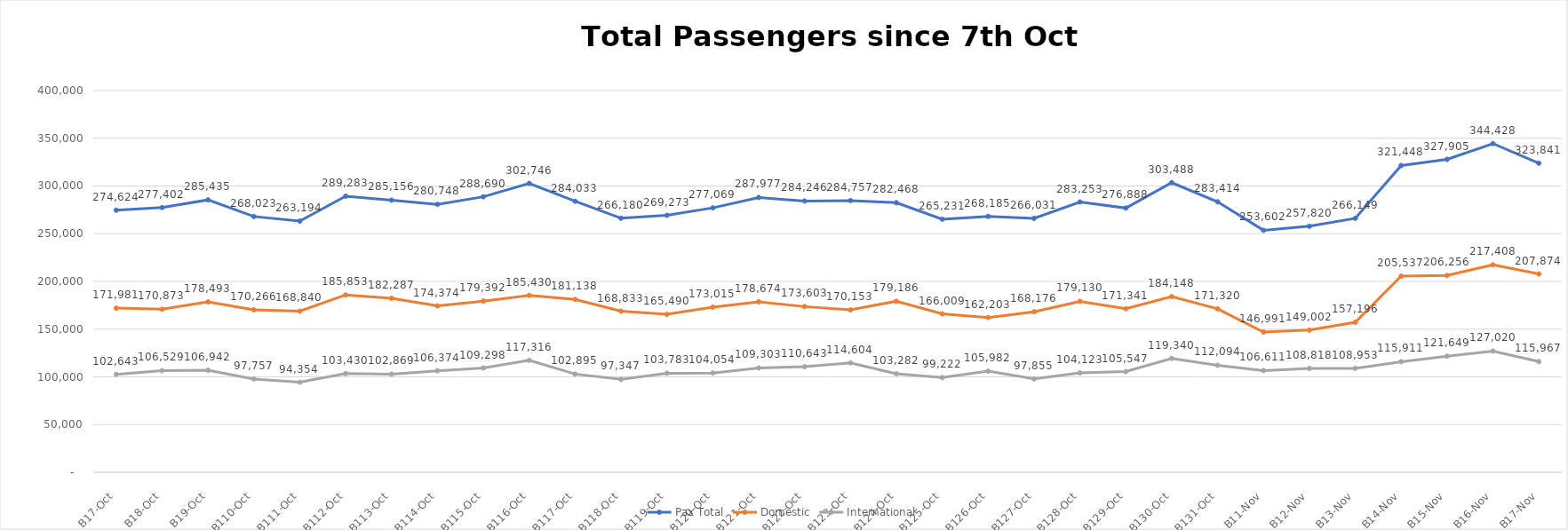
| Category | Pax Total |  Domestic  |  International  |
|---|---|---|---|
| 2022-10-07 | 274624 | 171981 | 102643 |
| 2022-10-08 | 277402 | 170873 | 106529 |
| 2022-10-09 | 285435 | 178493 | 106942 |
| 2022-10-10 | 268023 | 170266 | 97757 |
| 2022-10-11 | 263194 | 168840 | 94354 |
| 2022-10-12 | 289283 | 185853 | 103430 |
| 2022-10-13 | 285156 | 182287 | 102869 |
| 2022-10-14 | 280748 | 174374 | 106374 |
| 2022-10-15 | 288690 | 179392 | 109298 |
| 2022-10-16 | 302746 | 185430 | 117316 |
| 2022-10-17 | 284033 | 181138 | 102895 |
| 2022-10-18 | 266180 | 168833 | 97347 |
| 2022-10-19 | 269273 | 165490 | 103783 |
| 2022-10-20 | 277069 | 173015 | 104054 |
| 2022-10-21 | 287977 | 178674 | 109303 |
| 2022-10-22 | 284246 | 173603 | 110643 |
| 2022-10-23 | 284757 | 170153 | 114604 |
| 2022-10-24 | 282468 | 179186 | 103282 |
| 2022-10-25 | 265231 | 166009 | 99222 |
| 2022-10-26 | 268185 | 162203 | 105982 |
| 2022-10-27 | 266031 | 168176 | 97855 |
| 2022-10-28 | 283253 | 179130 | 104123 |
| 2022-10-29 | 276888 | 171341 | 105547 |
| 2022-10-30 | 303488 | 184148 | 119340 |
| 2022-10-31 | 283414 | 171320 | 112094 |
| 2022-11-01 | 253602 | 146991 | 106611 |
| 2022-11-02 | 257820 | 149002 | 108818 |
| 2022-11-03 | 266149 | 157196 | 108953 |
| 2022-11-04 | 321448 | 205537 | 115911 |
| 2022-11-05 | 327905 | 206256 | 121649 |
| 2022-11-06 | 344428 | 217408 | 127020 |
| 2022-11-07 | 323841 | 207874 | 115967 |